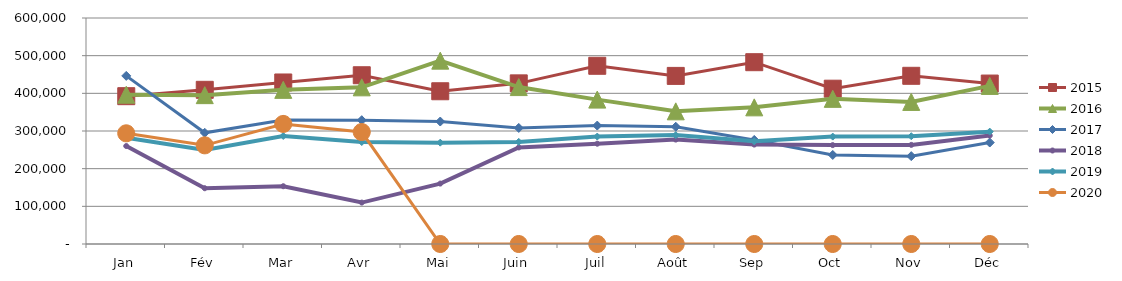
| Category | 2015 | 2016 | 2017 | 2018 | 2019 | 2020 |
|---|---|---|---|---|---|---|
| Jan | 392455.386 | 396263.914 | 446281.806 | 260114.073 | 282172.738 | 293841.353 |
| Fév | 409347.179 | 395175.975 | 295222.519 | 148036.843 | 249871.665 | 261954.608 |
| Mar | 428838.698 | 409222.091 | 329338.872 | 153395.928 | 286777.302 | 318758.795 |
| Avr | 448014.817 | 415901.642 | 328702.589 | 109982.902 | 270782.686 | 297258.355 |
| Mai | 405528.286 | 486763.336 | 325158.457 | 160382.707 | 269027.301 | 0 |
| Juin | 426462.87 | 416602.613 | 308100.463 | 256426.409 | 271108.83 | 0 |
| Juil | 473107.942 | 383313.72 | 314407.38 | 266269.669 | 285234.508 | 0 |
| Août | 446267.927 | 352198.565 | 311304.785 | 277231.878 | 289072.19 | 0 |
| Sep | 482677.503 | 362763.978 | 276260.727 | 263963.731 | 272549.159 | 0 |
| Oct | 412311.701 | 385353.331 | 236379.756 | 262549.621 | 285123.451 | 0 |
| Nov | 446526.169 | 377201.543 | 233251.128 | 263155.863 | 286119.242 | 0 |
| Déc | 425963.85 | 419714.854 | 269424.356 | 287963.859 | 298314.346 | 0 |